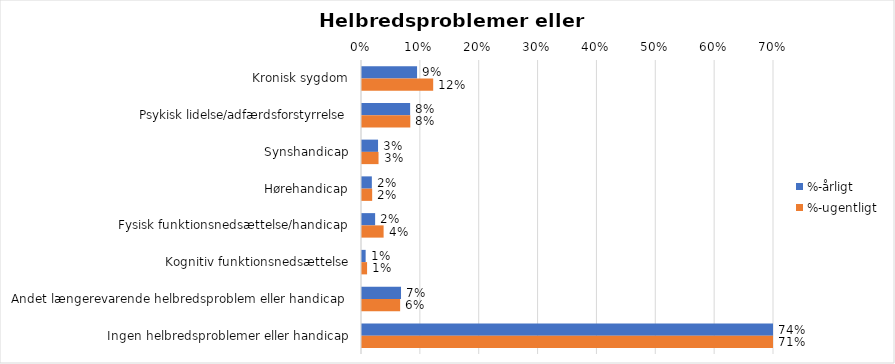
| Category | %-årligt | %-ugentligt |
|---|---|---|
| Kronisk sygdom | 0.094 | 0.121 |
| Psykisk lidelse/adfærdsforstyrrelse | 0.082 | 0.082 |
| Synshandicap | 0.027 | 0.028 |
| Hørehandicap | 0.017 | 0.017 |
| Fysisk funktionsnedsættelse/handicap | 0.022 | 0.037 |
| Kognitiv funktionsnedsættelse | 0.006 | 0.009 |
| Andet længerevarende helbredsproblem eller handicap  | 0.066 | 0.065 |
| Ingen helbredsproblemer eller handicap | 0.744 | 0.713 |